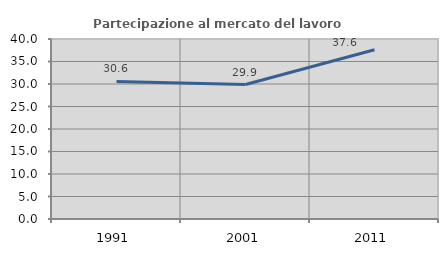
| Category | Partecipazione al mercato del lavoro  femminile |
|---|---|
| 1991.0 | 30.566 |
| 2001.0 | 29.88 |
| 2011.0 | 37.626 |